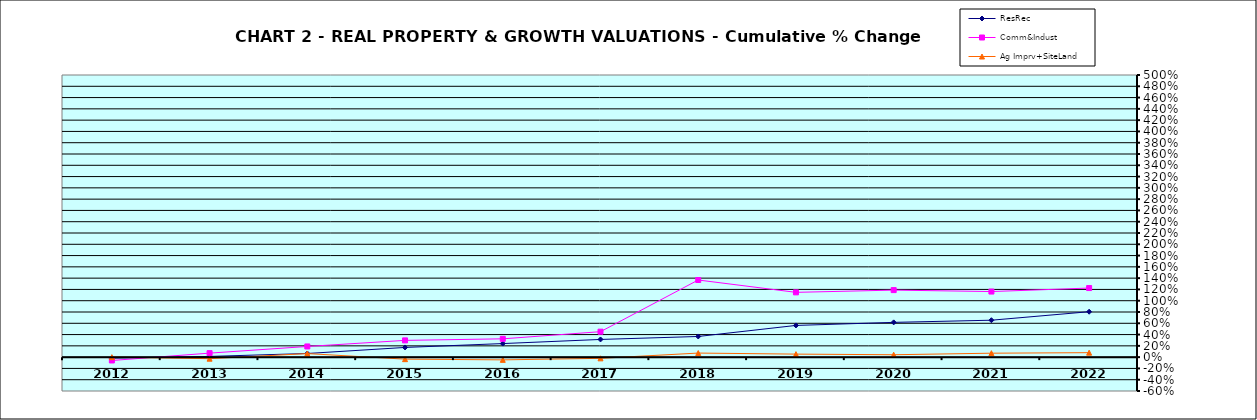
| Category | ResRec | Comm&Indust | Ag Imprv+SiteLand |
|---|---|---|---|
| 2012.0 | -0.018 | -0.059 | 0 |
| 2013.0 | 0.013 | 0.071 | -0.027 |
| 2014.0 | 0.065 | 0.189 | 0.063 |
| 2015.0 | 0.172 | 0.297 | -0.036 |
| 2016.0 | 0.24 | 0.325 | -0.048 |
| 2017.0 | 0.314 | 0.451 | -0.021 |
| 2018.0 | 0.366 | 1.367 | 0.072 |
| 2019.0 | 0.562 | 1.148 | 0.054 |
| 2020.0 | 0.616 | 1.188 | 0.043 |
| 2021.0 | 0.654 | 1.162 | 0.07 |
| 2022.0 | 0.805 | 1.224 | 0.079 |